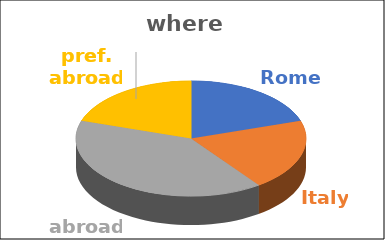
| Category | where | Series 1 | Series 2 | Series 3 | Series 4 |
|---|---|---|---|---|---|
| Rome | 0.2 |  |  |  |  |
| Italy | 0.2 |  |  |  |  |
| abroad | 0.4 |  |  |  |  |
| pref. abroad | 0.2 |  |  |  |  |